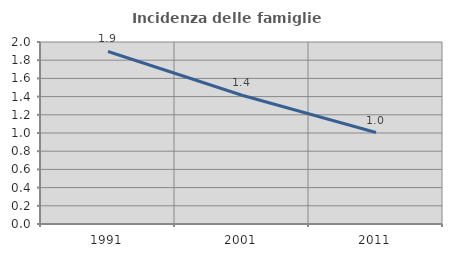
| Category | Incidenza delle famiglie numerose |
|---|---|
| 1991.0 | 1.896 |
| 2001.0 | 1.415 |
| 2011.0 | 1.005 |